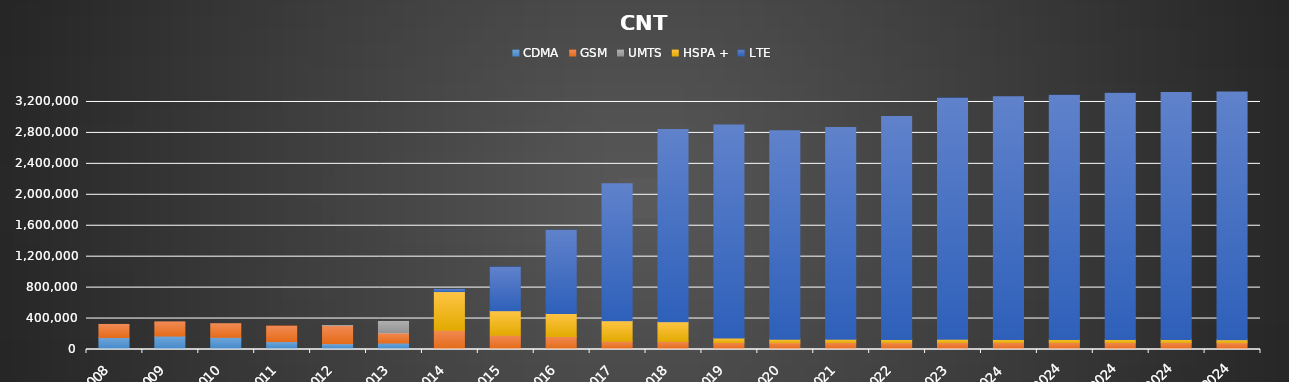
| Category | CDMA | GSM | UMTS | HSPA + | LTE |
|---|---|---|---|---|---|
| 2008 | 155151 | 168816 | 0 | 0 | 0 |
| 2009 | 173602 | 183298 | 0 | 0 | 0 |
| 2010 | 157438 | 176292 | 0 | 0 | 0 |
| 2011 | 102115 | 201253 | 0 | 0 | 0 |
| 2012 | 75179 | 233874 | 218 | 0 | 0 |
| 2013 | 83748 | 130396 | 148416 | 0 | 0 |
| 2014 | 3009 | 246983 | 0 | 498724 | 28176 |
| 2015 | 0 | 185171 | 0 | 316427 | 564105 |
| 2016 | 0 | 167794 | 0 | 297924 | 1075501 |
| 2017 | 0 | 105840 | 0 | 265966 | 1770311 |
| 2018 | 0 | 104907 | 0 | 252233 | 2488002 |
| 2019 | 0 | 90785 | 0 | 57576 | 2755329 |
| 2020 | 0 | 88328 | 0 | 42633 | 2695427 |
| 2021 | 0 | 90490 | 0 | 41720 | 2737207 |
| 2022 | 0 | 89457 | 0 | 40667 | 2881775 |
| 2023 | 0 | 91235 | 0 | 40016 | 3119071 |
| Ene 2024 | 0 | 90857 | 0 | 39987 | 3136814 |
| Feb2024 | 0 | 90666 | 0 | 39954 | 3157848 |
| Mar2024 | 0 | 90578 | 0 | 39942 | 3181430 |
| Abr2024 | 0 | 90193 | 0 | 39501 | 3191529 |
| May2024 | 0 | 89334 | 0 | 37945 | 3202981 |